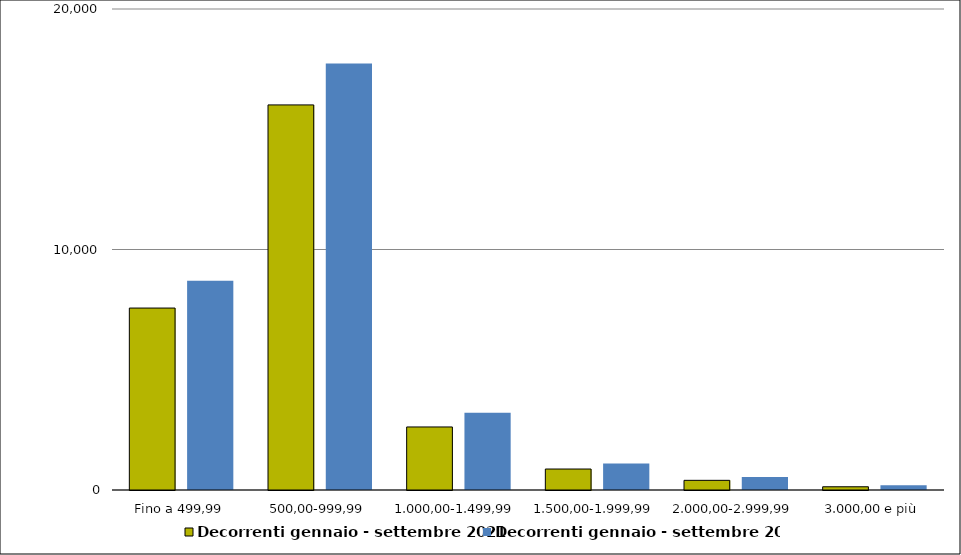
| Category | Decorrenti gennaio - settembre 2021 | Decorrenti gennaio - settembre 2020 |
|---|---|---|
|  Fino a 499,99  | 7565 | 8698 |
|  500,00-999,99  | 16012 | 17730 |
|  1.000,00-1.499,99  | 2621 | 3211 |
|  1.500,00-1.999,99  | 872 | 1103 |
|  2.000,00-2.999,99  | 402 | 538 |
|  3.000,00 e più  | 134 | 197 |